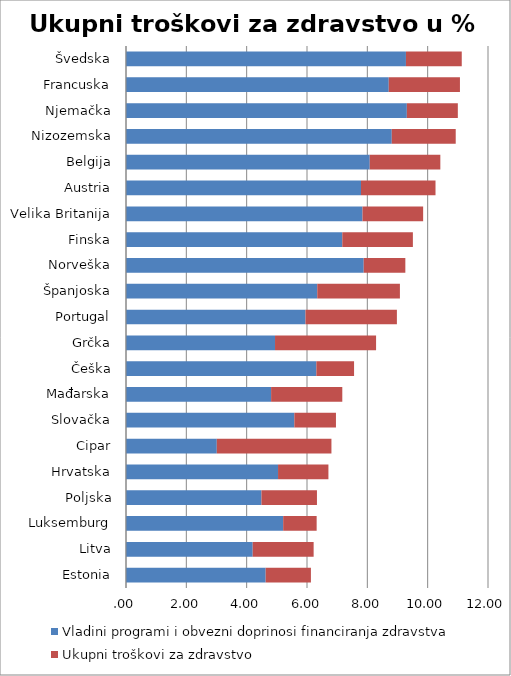
| Category | Vladini programi i obvezni doprinosi financiranja zdravstva | Ukupni troškovi za zdravstvo |
|---|---|---|
| Estonia | 4.63 | 1.5 |
| Litva | 4.2 | 2.02 |
| Luksemburg | 5.21 | 1.11 |
| Poljska | 4.49 | 1.84 |
| Hrvatska | 5.04 | 1.67 |
| Cipar | 3.01 | 3.8 |
| Slovačka | 5.58 | 1.38 |
| Mađarska | 4.81 | 2.36 |
| Češka | 6.31 | 1.25 |
| Grčka | 4.94 | 3.35 |
| Portugal | 5.95 | 3.03 |
| Španjoska | 6.34 | 2.74 |
| Norveška | 7.88 | 1.38 |
| Finska | 7.17 | 2.34 |
| Velika Britanija | 7.84 | 2.01 |
| Austria | 7.79 | 2.47 |
| Belgija | 8.08 | 2.34 |
| Nizozemska | 8.81 | 2.12 |
| Njemačka | 9.31 | 1.69 |
| Francuska | 8.71 | 2.36 |
| Švedska | 9.28 | 1.85 |